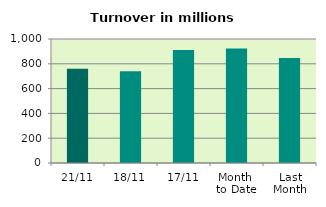
| Category | Series 0 |
|---|---|
| 21/11 | 760.184 |
| 18/11 | 739.653 |
| 17/11 | 910.977 |
| Month 
to Date | 923.083 |
| Last
Month | 847.422 |